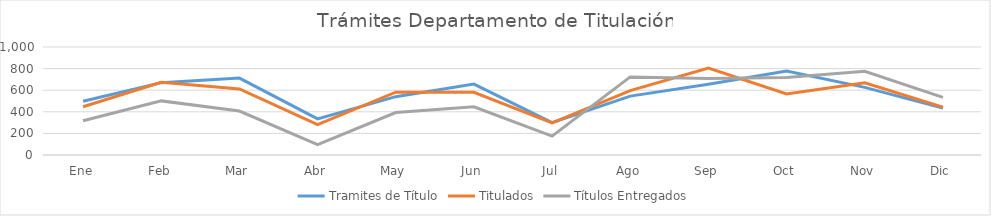
| Category | Tramites de Título | Titulados | Títulos Entregados |
|---|---|---|---|
| Ene | 498 | 447 | 317 |
| Feb | 670 | 674 | 501 |
| Mar | 712 | 612 | 407 |
| Abr | 334 | 281 | 95 |
| May | 540 | 582 | 393 |
| Jun | 657 | 580 | 447 |
| Jul | 299 | 298 | 175 |
| Ago | 545 | 596 | 723 |
| Sep | 655 | 806 | 708 |
| Oct | 777 | 565 | 718 |
| Nov | 626 | 668 | 775 |
| Dic | 434 | 443 | 534 |